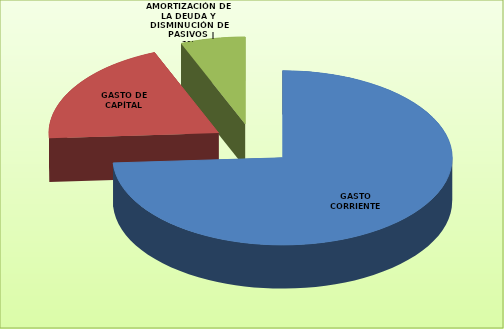
| Category | Series 0 |
|---|---|
| GASTO CORRIENTE | 44588627 |
| GASTO DE CAPÍTAL | 11898786 |
| AMORTIZACIÓN DE LA DEUDA Y DISMINUCIÓN DE PASIVOS | 3712858 |